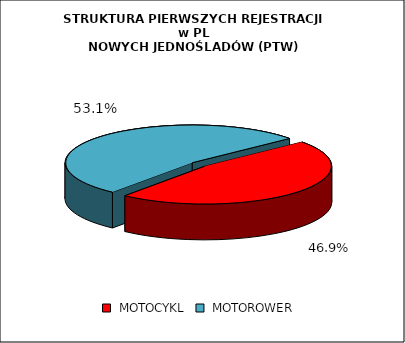
| Category | RAZEM |
|---|---|
|  MOTOCYKL  | 0.469 |
|  MOTOROWER  | 0.531 |